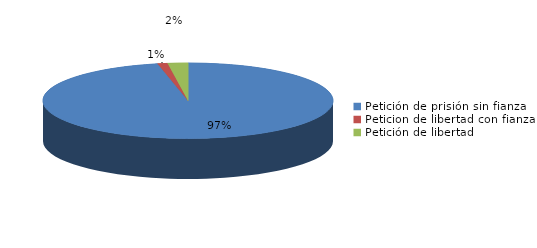
| Category | Series 0 |
|---|---|
| Petición de prisión sin fianza | 86 |
| Peticion de libertad con fianza | 1 |
| Petición de libertad | 2 |